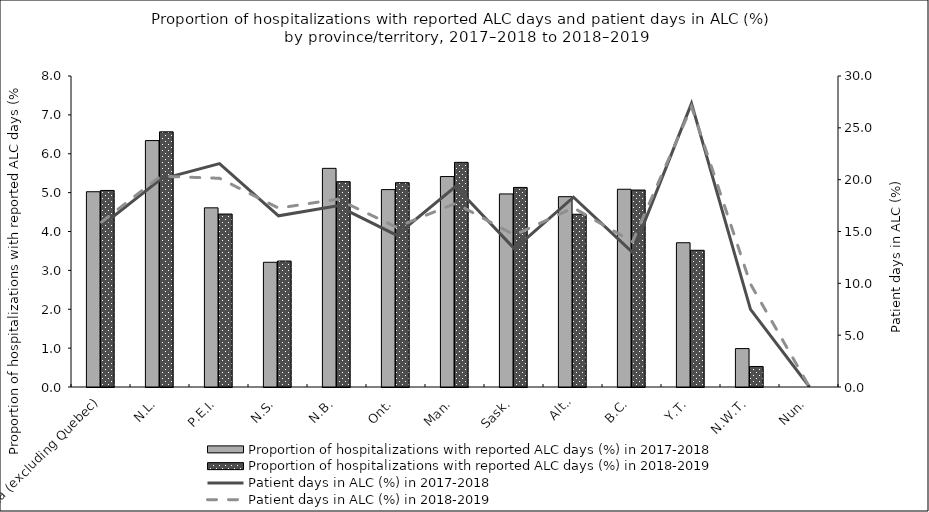
| Category | Proportion of hospitalizations with reported ALC days (%) in 2017-2018 | Proportion of hospitalizations with reported ALC days (%) in 2018-2019 |
|---|---|---|
| Canada (excluding Quebec) | 5.023 | 5.056 |
| N.L. | 6.339 | 6.563 |
| P.E.I. | 4.609 | 4.449 |
| N.S. | 3.208 | 3.24 |
| N.B. | 5.624 | 5.282 |
| Ont. | 5.078 | 5.256 |
| Man. | 5.414 | 5.779 |
| Sask. | 4.966 | 5.134 |
| Alta. | 4.896 | 4.444 |
| B.C. | 5.087 | 5.067 |
| Y.T. | 3.711 | 3.517 |
| N.W.T. | 0.988 | 0.528 |
| Nun. | 0 | 0 |